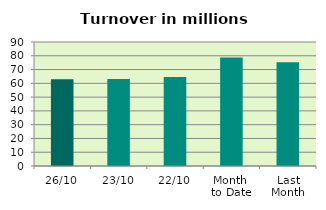
| Category | Series 0 |
|---|---|
| 26/10 | 63.054 |
| 23/10 | 63.116 |
| 22/10 | 64.577 |
| Month 
to Date | 78.764 |
| Last
Month | 75.235 |